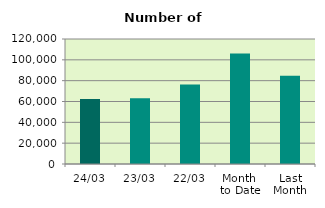
| Category | Series 0 |
|---|---|
| 24/03 | 62290 |
| 23/03 | 63024 |
| 22/03 | 76298 |
| Month 
to Date | 106163.556 |
| Last
Month | 84726.4 |